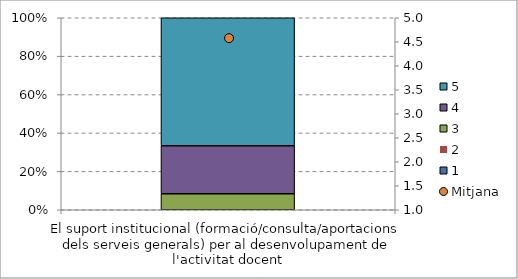
| Category | 1 | 2 | 3 | 4 | 5 |
|---|---|---|---|---|---|
| El suport institucional (formació/consulta/aportacions dels serveis generals) per al desenvolupament de l'activitat docent | 0 | 0 | 0.083 | 0.25 | 0.667 |